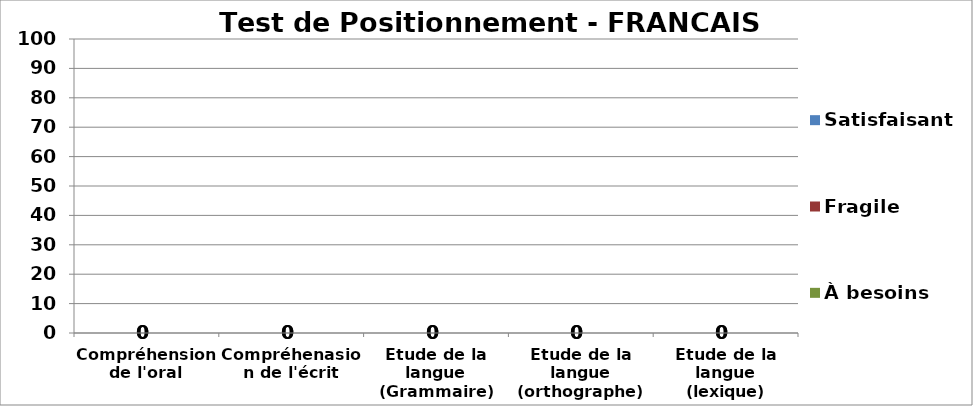
| Category | À besoins | Fragile | Satisfaisant |
|---|---|---|---|
| Compréhension de l'oral
 | 0 | 0 | 0 |
| Compréhenasion de l'écrit | 0 | 0 | 0 |
| Etude de la langue (Grammaire) | 0 | 0 | 0 |
| Etude de la langue (orthographe) | 0 | 0 | 0 |
| Etude de la langue (lexique) | 0 | 0 | 0 |